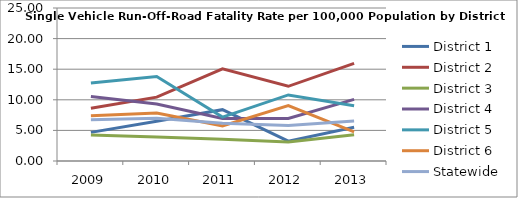
| Category | District 1 | District 2 | District 3 | District 4 | District 5 | District 6 | Statewide |
|---|---|---|---|---|---|---|---|
| 2009.0 | 4.68 | 8.613 | 4.261 | 10.556 | 12.764 | 7.409 | 6.759 |
| 2010.0 | 6.505 | 10.436 | 3.937 | 9.322 | 13.81 | 7.824 | 6.987 |
| 2011.0 | 8.387 | 15.064 | 3.569 | 6.951 | 7.172 | 5.733 | 6.155 |
| 2012.0 | 3.249 | 12.206 | 3.097 | 6.946 | 10.795 | 9.068 | 5.804 |
| 2013.0 | 5.516 | 15.949 | 4.291 | 10.06 | 9.029 | 4.749 | 6.517 |